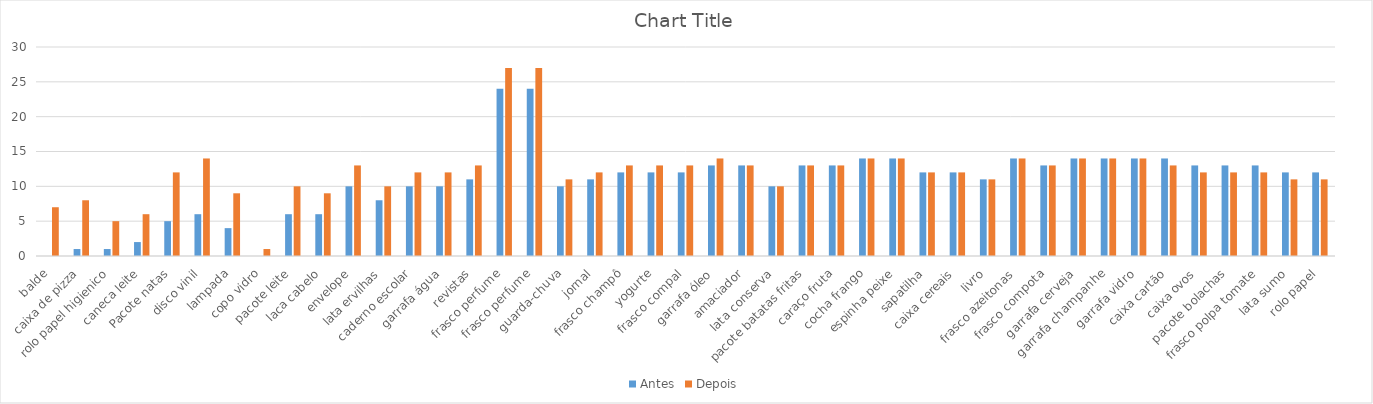
| Category | Antes | Depois |
|---|---|---|
| balde | 0 | 7 |
| caixa de pizza | 1 | 8 |
| rolo papel higienico | 1 | 5 |
| caneca leite | 2 | 6 |
| Pacote natas | 5 | 12 |
| disco vinil | 6 | 14 |
| lampada | 4 | 9 |
| copo vidro | 0 | 1 |
| pacote leite | 6 | 10 |
| laca cabelo | 6 | 9 |
| envelope | 10 | 13 |
| lata ervilhas | 8 | 10 |
| caderno escolar | 10 | 12 |
| garrafa água | 10 | 12 |
| revistas | 11 | 13 |
| frasco perfume | 24 | 27 |
| frasco perfume | 24 | 27 |
| guarda-chuva | 10 | 11 |
| jornal | 11 | 12 |
| frasco champô | 12 | 13 |
| yogurte | 12 | 13 |
| frasco compal | 12 | 13 |
| garrafa óleo | 13 | 14 |
| amaciador | 13 | 13 |
| lata conserva | 10 | 10 |
| pacote batatas fritas | 13 | 13 |
| caraço fruta | 13 | 13 |
| cocha frango | 14 | 14 |
| espinha peixe | 14 | 14 |
| sapatilha | 12 | 12 |
| caixa cereais | 12 | 12 |
| livro | 11 | 11 |
| frasco azeitonas | 14 | 14 |
| frasco compota | 13 | 13 |
| garrafa cerveja | 14 | 14 |
| garrafa champanhe | 14 | 14 |
| garrafa vidro | 14 | 14 |
| caixa cartão | 14 | 13 |
| caixa ovos | 13 | 12 |
| pacote bolachas | 13 | 12 |
| frasco polpa tomate | 13 | 12 |
| lata sumo | 12 | 11 |
| rolo papel | 12 | 11 |